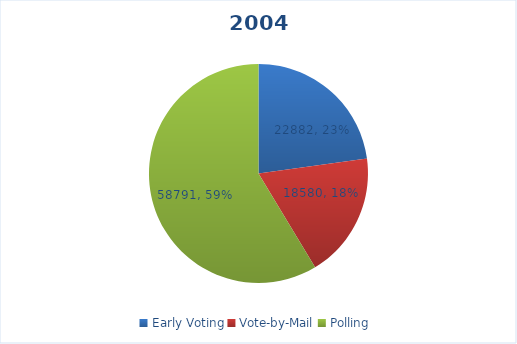
| Category | Series 0 |
|---|---|
| Early Voting | 22882 |
| Vote-by-Mail | 18580 |
| Polling | 58791 |